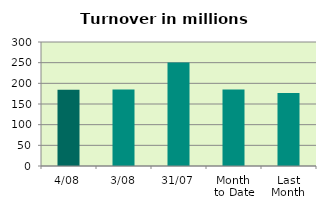
| Category | Series 0 |
|---|---|
| 4/08 | 184.576 |
| 3/08 | 185.324 |
| 31/07 | 250.285 |
| Month 
to Date | 184.95 |
| Last
Month | 176.477 |